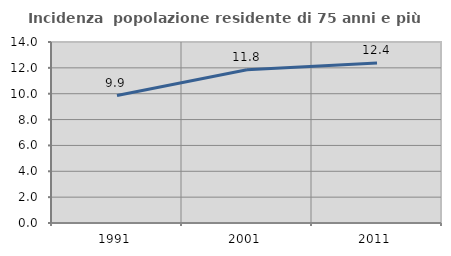
| Category | Incidenza  popolazione residente di 75 anni e più |
|---|---|
| 1991.0 | 9.86 |
| 2001.0 | 11.846 |
| 2011.0 | 12.378 |